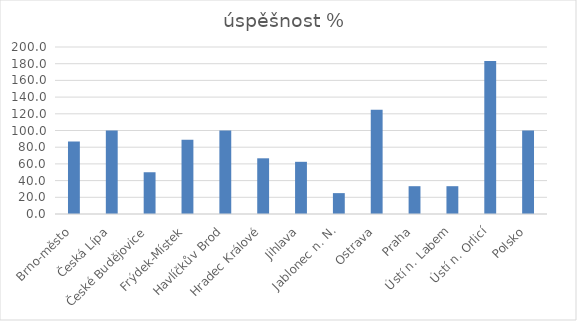
| Category | úspěšnost %  |
|---|---|
| Brno-město | 86.7 |
| Česká Lípa | 100 |
| České Budějovice | 50 |
| Frýdek-Místek | 88.9 |
| Havlíčkův Brod | 100 |
| Hradec Králové | 66.7 |
| Jihlava | 62.5 |
| Jablonec n. N. | 25 |
| Ostrava | 125 |
| Praha | 33.3 |
| Ústí n. Labem | 33.3 |
| Ústí n. Orlicí | 183.3 |
| Polsko | 100 |